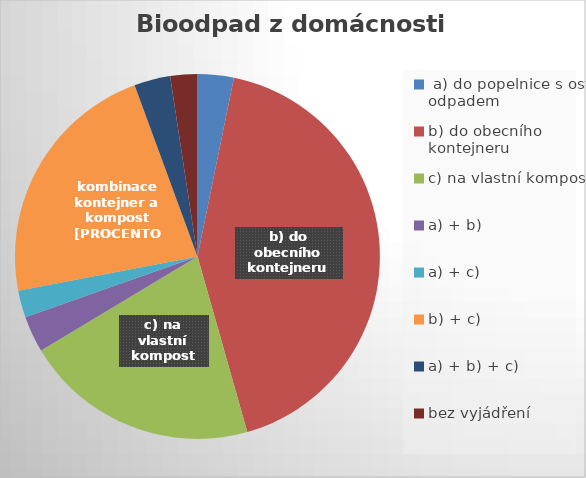
| Category | Bioodpad z domácnosti ukládám  |
|---|---|
|  a) do popelnice s ost. odpadem | 4 |
| b) do obecního kontejneru | 53 |
| c) na vlastní kompost | 26 |
| a) + b) | 4 |
| a) + c) | 3 |
| b) + c) | 28 |
| a) + b) + c)  | 4 |
| bez vyjádření | 3 |